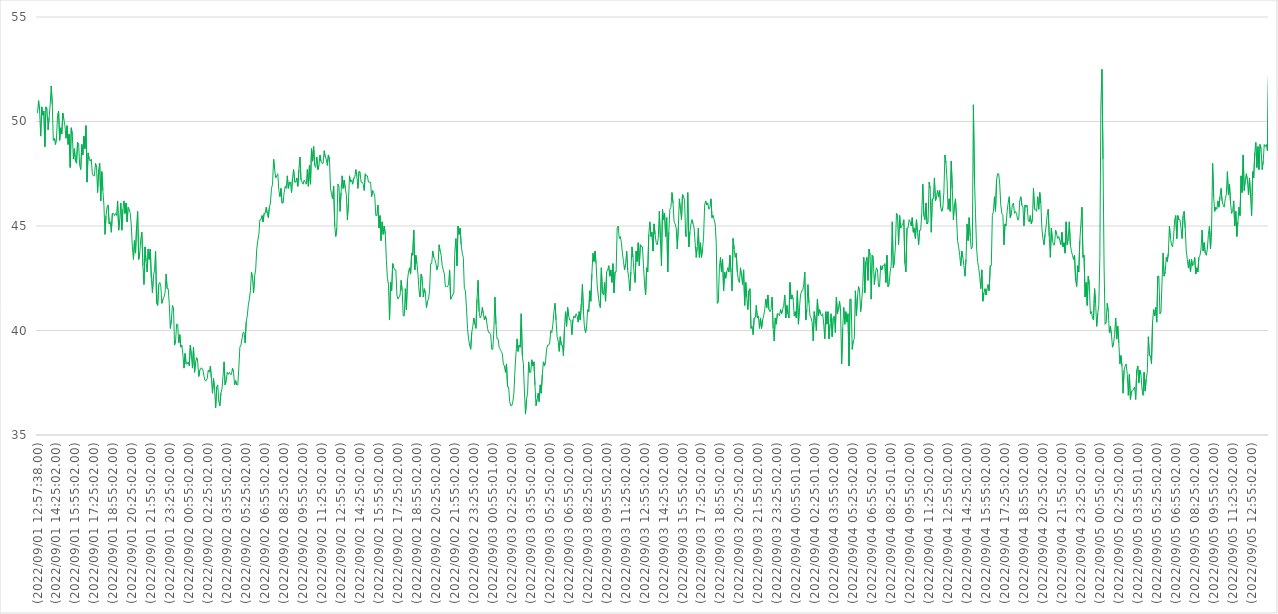
| Category | Series 0 |
|---|---|
| (2022/09/01 12:57:38.00) | 50.4 |
| (2022/09/01 13:00:01.00) | 51 |
| (2022/09/01 13:05:02.00) | 50.5 |
| (2022/09/01 13:10:01.00) | 49.3 |
| (2022/09/01 13:15:01.00) | 50.7 |
| (2022/09/01 13:20:01.00) | 50.3 |
| (2022/09/01 13:25:01.00) | 50.5 |
| (2022/09/01 13:30:01.00) | 48.8 |
| (2022/09/01 13:35:01.00) | 50.7 |
| (2022/09/01 13:40:01.00) | 50.6 |
| (2022/09/01 13:45:01.00) | 49.6 |
| (2022/09/01 13:50:02.00) | 50.2 |
| (2022/09/01 13:55:01.00) | 50.8 |
| (2022/09/01 14:00:02.00) | 51.7 |
| (2022/09/01 14:05:02.00) | 50.8 |
| (2022/09/01 14:10:01.00) | 49.1 |
| (2022/09/01 14:15:02.00) | 49.2 |
| (2022/09/01 14:20:01.00) | 48.9 |
| (2022/09/01 14:25:02.00) | 49.2 |
| (2022/09/01 14:30:01.00) | 50.3 |
| (2022/09/01 14:35:01.00) | 50.5 |
| (2022/09/01 14:40:02.00) | 49.1 |
| (2022/09/01 14:45:02.00) | 49.7 |
| (2022/09/01 14:50:02.00) | 49.4 |
| (2022/09/01 14:55:02.00) | 50.4 |
| (2022/09/01 15:00:02.00) | 50.1 |
| (2022/09/01 15:05:02.00) | 49.8 |
| (2022/09/01 15:10:02.00) | 49.2 |
| (2022/09/01 15:15:01.00) | 49.8 |
| (2022/09/01 15:20:02.00) | 48.9 |
| (2022/09/01 15:25:01.00) | 49.4 |
| (2022/09/01 15:30:02.00) | 47.8 |
| (2022/09/01 15:35:02.00) | 49.7 |
| (2022/09/01 15:40:01.00) | 49.4 |
| (2022/09/01 15:45:02.00) | 48.2 |
| (2022/09/01 15:50:01.00) | 48.7 |
| (2022/09/01 15:55:02.00) | 48.1 |
| (2022/09/01 16:00:02.00) | 48 |
| (2022/09/01 16:05:02.00) | 49 |
| (2022/09/01 16:10:02.00) | 48.9 |
| (2022/09/01 16:15:02.00) | 47.9 |
| (2022/09/01 16:20:02.00) | 47.7 |
| (2022/09/01 16:25:02.00) | 48.9 |
| (2022/09/01 16:30:02.00) | 48.4 |
| (2022/09/01 16:35:02.00) | 49.3 |
| (2022/09/01 16:40:02.00) | 48.7 |
| (2022/09/01 16:45:01.00) | 49.8 |
| (2022/09/01 16:50:02.00) | 47.1 |
| (2022/09/01 16:55:02.00) | 48.5 |
| (2022/09/01 17:00:02.00) | 48.2 |
| (2022/09/01 17:05:02.00) | 48.1 |
| (2022/09/01 17:10:01.00) | 48.2 |
| (2022/09/01 17:15:02.00) | 47.5 |
| (2022/09/01 17:20:02.00) | 47.4 |
| (2022/09/01 17:25:02.00) | 47.4 |
| (2022/09/01 17:30:02.00) | 48 |
| (2022/09/01 17:35:02.00) | 47.8 |
| (2022/09/01 17:40:02.00) | 46.6 |
| (2022/09/01 17:45:02.00) | 47.7 |
| (2022/09/01 17:50:02.00) | 48 |
| (2022/09/01 17:55:02.00) | 46.2 |
| (2022/09/01 18:00:02.00) | 47.6 |
| (2022/09/01 18:05:02.00) | 46.7 |
| (2022/09/01 18:10:02.00) | 46 |
| (2022/09/01 18:15:02.00) | 44.6 |
| (2022/09/01 18:20:02.00) | 45.5 |
| (2022/09/01 18:25:02.00) | 45.9 |
| (2022/09/01 18:30:02.00) | 46 |
| (2022/09/01 18:35:02.00) | 45.1 |
| (2022/09/01 18:40:02.00) | 45.2 |
| (2022/09/01 18:45:02.00) | 44.7 |
| (2022/09/01 18:50:02.00) | 45.6 |
| (2022/09/01 18:55:02.00) | 45.6 |
| (2022/09/01 19:00:02.00) | 45.5 |
| (2022/09/01 19:05:02.00) | 45.6 |
| (2022/09/01 19:10:02.00) | 45.5 |
| (2022/09/01 19:15:02.00) | 46.2 |
| (2022/09/01 19:20:02.00) | 44.8 |
| (2022/09/01 19:25:02.00) | 45.3 |
| (2022/09/01 19:30:02.00) | 46.1 |
| (2022/09/01 19:35:02.00) | 44.8 |
| (2022/09/01 19:40:02.00) | 45.8 |
| (2022/09/01 19:45:02.00) | 46.2 |
| (2022/09/01 19:50:02.00) | 45.6 |
| (2022/09/01 19:55:02.00) | 46.1 |
| (2022/09/01 20:00:02.00) | 45.2 |
| (2022/09/01 20:05:02.00) | 45.9 |
| (2022/09/01 20:10:02.00) | 45.8 |
| (2022/09/01 20:15:02.00) | 45.6 |
| (2022/09/01 20:20:02.00) | 45 |
| (2022/09/01 20:25:02.00) | 44 |
| (2022/09/01 20:30:02.00) | 43.4 |
| (2022/09/01 20:35:02.00) | 44.3 |
| (2022/09/01 20:40:02.00) | 43.7 |
| (2022/09/01 20:45:02.00) | 45 |
| (2022/09/01 20:50:02.00) | 45.7 |
| (2022/09/01 20:55:02.00) | 43.4 |
| (2022/09/01 21:00:02.00) | 43.7 |
| (2022/09/01 21:05:02.00) | 44.4 |
| (2022/09/01 21:10:02.00) | 44.7 |
| (2022/09/01 21:15:02.00) | 43.1 |
| (2022/09/01 21:20:02.00) | 42.2 |
| (2022/09/01 21:25:01.00) | 44 |
| (2022/09/01 21:30:02.00) | 43.3 |
| (2022/09/01 21:35:01.00) | 42.8 |
| (2022/09/01 21:40:02.00) | 43.9 |
| (2022/09/01 21:45:02.00) | 43.4 |
| (2022/09/01 21:50:02.00) | 43.9 |
| (2022/09/01 21:55:02.00) | 42.5 |
| (2022/09/01 22:00:02.00) | 41.8 |
| (2022/09/01 22:05:02.00) | 42.6 |
| (2022/09/01 22:10:02.00) | 42.9 |
| (2022/09/01 22:15:01.00) | 43.8 |
| (2022/09/01 22:20:02.00) | 41.3 |
| (2022/09/01 22:25:02.00) | 41.2 |
| (2022/09/01 22:30:02.00) | 42.2 |
| (2022/09/01 22:35:02.00) | 42.3 |
| (2022/09/01 22:40:02.00) | 42.1 |
| (2022/09/01 22:45:02.00) | 41.3 |
| (2022/09/01 22:50:01.00) | 41.5 |
| (2022/09/01 22:55:02.00) | 41.6 |
| (2022/09/01 23:00:02.00) | 41.8 |
| (2022/09/01 23:05:01.00) | 42.7 |
| (2022/09/01 23:10:02.00) | 42 |
| (2022/09/01 23:15:02.00) | 42 |
| (2022/09/01 23:20:01.00) | 41.3 |
| (2022/09/01 23:25:02.00) | 40.1 |
| (2022/09/01 23:30:02.00) | 40.5 |
| (2022/09/01 23:35:02.00) | 41.2 |
| (2022/09/01 23:40:02.00) | 41.1 |
| (2022/09/01 23:45:01.00) | 39.3 |
| (2022/09/01 23:50:02.00) | 39.5 |
| (2022/09/01 23:55:02.00) | 40.3 |
| (2022/09/02 00:00:02.00) | 40.3 |
| (2022/09/02 00:05:01.00) | 39.4 |
| (2022/09/02 00:10:01.00) | 39.8 |
| (2022/09/02 00:15:01.00) | 39.2 |
| (2022/09/02 00:20:01.00) | 39.3 |
| (2022/09/02 00:25:01.00) | 38.8 |
| (2022/09/02 00:30:02.00) | 38.2 |
| (2022/09/02 00:35:01.00) | 38.9 |
| (2022/09/02 00:40:01.00) | 38.4 |
| (2022/09/02 00:45:01.00) | 38.4 |
| (2022/09/02 00:50:01.00) | 38.5 |
| (2022/09/02 00:55:02.00) | 38.3 |
| (2022/09/02 01:00:01.00) | 39.3 |
| (2022/09/02 01:05:02.00) | 38.8 |
| (2022/09/02 01:10:01.00) | 38.2 |
| (2022/09/02 01:15:01.00) | 39.2 |
| (2022/09/02 01:20:02.00) | 38 |
| (2022/09/02 01:25:01.00) | 38.5 |
| (2022/09/02 01:30:02.00) | 38.7 |
| (2022/09/02 01:35:01.00) | 38.5 |
| (2022/09/02 01:40:02.00) | 37.8 |
| (2022/09/02 01:45:02.00) | 38.1 |
| (2022/09/02 01:50:02.00) | 38.2 |
| (2022/09/02 01:55:02.00) | 38.2 |
| (2022/09/02 02:00:02.00) | 38.1 |
| (2022/09/02 02:05:02.00) | 37.8 |
| (2022/09/02 02:10:01.00) | 37.6 |
| (2022/09/02 02:15:02.00) | 37.6 |
| (2022/09/02 02:20:02.00) | 37.7 |
| (2022/09/02 02:25:02.00) | 38.1 |
| (2022/09/02 02:30:01.00) | 38 |
| (2022/09/02 02:35:02.00) | 38.3 |
| (2022/09/02 02:40:02.00) | 37.7 |
| (2022/09/02 02:45:02.00) | 37 |
| (2022/09/02 02:50:02.00) | 37.7 |
| (2022/09/02 02:55:01.00) | 37.2 |
| (2022/09/02 03:00:02.00) | 36.3 |
| (2022/09/02 03:05:02.00) | 37.3 |
| (2022/09/02 03:10:02.00) | 37.4 |
| (2022/09/02 03:15:02.00) | 36.6 |
| (2022/09/02 03:20:02.00) | 36.4 |
| (2022/09/02 03:25:02.00) | 37 |
| (2022/09/02 03:30:02.00) | 37.2 |
| (2022/09/02 03:35:02.00) | 37.8 |
| (2022/09/02 03:40:02.00) | 38.5 |
| (2022/09/02 03:45:02.00) | 37.4 |
| (2022/09/02 03:50:01.00) | 37.6 |
| (2022/09/02 03:55:02.00) | 38 |
| (2022/09/02 04:00:02.00) | 37.9 |
| (2022/09/02 04:05:01.00) | 38 |
| (2022/09/02 04:10:02.00) | 37.9 |
| (2022/09/02 04:15:02.00) | 37.9 |
| (2022/09/02 04:20:01.00) | 38.2 |
| (2022/09/02 04:25:02.00) | 38 |
| (2022/09/02 04:30:02.00) | 37.4 |
| (2022/09/02 04:35:02.00) | 37.6 |
| (2022/09/02 04:40:02.00) | 37.4 |
| (2022/09/02 04:45:02.00) | 37.4 |
| (2022/09/02 04:50:02.00) | 38.2 |
| (2022/09/02 04:55:02.00) | 39.2 |
| (2022/09/02 05:00:02.00) | 39.3 |
| (2022/09/02 05:05:02.00) | 39.6 |
| (2022/09/02 05:10:01.00) | 39.9 |
| (2022/09/02 05:15:02.00) | 39.9 |
| (2022/09/02 05:20:02.00) | 39.4 |
| (2022/09/02 05:25:02.00) | 40.4 |
| (2022/09/02 05:30:02.00) | 40.7 |
| (2022/09/02 05:35:02.00) | 41.2 |
| (2022/09/02 05:40:02.00) | 41.5 |
| (2022/09/02 05:45:02.00) | 41.9 |
| (2022/09/02 05:50:02.00) | 42.8 |
| (2022/09/02 05:55:01.00) | 42.5 |
| (2022/09/02 06:00:02.00) | 41.8 |
| (2022/09/02 06:05:02.00) | 42.6 |
| (2022/09/02 06:10:02.00) | 42.9 |
| (2022/09/02 06:15:02.00) | 43.9 |
| (2022/09/02 06:20:02.00) | 44.3 |
| (2022/09/02 06:25:02.00) | 44.6 |
| (2022/09/02 06:30:02.00) | 45.3 |
| (2022/09/02 06:35:02.00) | 45.3 |
| (2022/09/02 06:40:02.00) | 45.5 |
| (2022/09/02 06:45:02.00) | 45.2 |
| (2022/09/02 06:50:02.00) | 45.6 |
| (2022/09/02 06:55:02.00) | 45.6 |
| (2022/09/02 07:00:02.00) | 45.9 |
| (2022/09/02 07:05:02.00) | 45.6 |
| (2022/09/02 07:10:02.00) | 45.4 |
| (2022/09/02 07:15:02.00) | 45.9 |
| (2022/09/02 07:20:02.00) | 46.1 |
| (2022/09/02 07:25:02.00) | 46.8 |
| (2022/09/02 07:30:02.00) | 47 |
| (2022/09/02 07:35:02.00) | 48.2 |
| (2022/09/02 07:40:02.00) | 47.7 |
| (2022/09/02 07:45:02.00) | 47.3 |
| (2022/09/02 07:50:02.00) | 47.4 |
| (2022/09/02 07:55:02.00) | 47.5 |
| (2022/09/02 08:00:02.00) | 46.7 |
| (2022/09/02 08:05:02.00) | 46.4 |
| (2022/09/02 08:10:02.00) | 46.8 |
| (2022/09/02 08:15:02.00) | 46.1 |
| (2022/09/02 08:20:01.00) | 46.1 |
| (2022/09/02 08:25:02.00) | 46.6 |
| (2022/09/02 08:30:02.00) | 46.9 |
| (2022/09/02 08:35:02.00) | 46.8 |
| (2022/09/02 08:40:02.00) | 47.4 |
| (2022/09/02 08:45:02.00) | 46.8 |
| (2022/09/02 08:50:02.00) | 47.1 |
| (2022/09/02 08:55:02.00) | 47.1 |
| (2022/09/02 09:00:01.00) | 46.6 |
| (2022/09/02 09:05:02.00) | 47.3 |
| (2022/09/02 09:10:02.00) | 47.7 |
| (2022/09/02 09:15:02.00) | 47.1 |
| (2022/09/02 09:20:02.00) | 47.1 |
| (2022/09/02 09:25:01.00) | 47.3 |
| (2022/09/02 09:30:02.00) | 46.9 |
| (2022/09/02 09:35:02.00) | 47.7 |
| (2022/09/02 09:40:02.00) | 48.3 |
| (2022/09/02 09:45:02.00) | 47.2 |
| (2022/09/02 09:50:01.00) | 47.1 |
| (2022/09/02 09:55:02.00) | 47 |
| (2022/09/02 10:00:02.00) | 47.2 |
| (2022/09/02 10:05:02.00) | 47.1 |
| (2022/09/02 10:10:02.00) | 47 |
| (2022/09/02 10:15:02.00) | 47.7 |
| (2022/09/02 10:20:02.00) | 46.9 |
| (2022/09/02 10:25:02.00) | 47.9 |
| (2022/09/02 10:30:02.00) | 47 |
| (2022/09/02 10:35:02.00) | 48.7 |
| (2022/09/02 10:40:02.00) | 48.1 |
| (2022/09/02 10:45:02.00) | 48.8 |
| (2022/09/02 10:50:02.00) | 47.9 |
| (2022/09/02 10:55:02.00) | 47.8 |
| (2022/09/02 11:00:02.00) | 48.3 |
| (2022/09/02 11:05:02.00) | 47.7 |
| (2022/09/02 11:10:02.00) | 47.9 |
| (2022/09/02 11:15:02.00) | 48.4 |
| (2022/09/02 11:20:02.00) | 48.1 |
| (2022/09/02 11:25:02.00) | 48 |
| (2022/09/02 11:30:02.00) | 48 |
| (2022/09/02 11:35:02.00) | 48.6 |
| (2022/09/02 11:40:02.00) | 48.3 |
| (2022/09/02 11:45:02.00) | 48.2 |
| (2022/09/02 11:50:02.00) | 47.9 |
| (2022/09/02 11:55:02.00) | 48.4 |
| (2022/09/02 12:00:02.00) | 48.2 |
| (2022/09/02 12:05:02.00) | 46.8 |
| (2022/09/02 12:10:02.00) | 46.5 |
| (2022/09/02 12:15:02.00) | 46.3 |
| (2022/09/02 12:20:02.00) | 46.9 |
| (2022/09/02 12:25:02.00) | 45 |
| (2022/09/02 12:30:02.00) | 44.5 |
| (2022/09/02 12:35:02.00) | 44.9 |
| (2022/09/02 12:40:02.00) | 47 |
| (2022/09/02 12:45:02.00) | 46.9 |
| (2022/09/02 12:50:02.00) | 45.7 |
| (2022/09/02 12:55:02.00) | 46.6 |
| (2022/09/02 13:00:02.00) | 47.4 |
| (2022/09/02 13:05:02.00) | 46.8 |
| (2022/09/02 13:10:02.00) | 47.2 |
| (2022/09/02 13:15:02.00) | 46.8 |
| (2022/09/02 13:20:02.00) | 46.5 |
| (2022/09/02 13:25:02.00) | 45.3 |
| (2022/09/02 13:30:02.00) | 46.1 |
| (2022/09/02 13:35:02.00) | 47.4 |
| (2022/09/02 13:40:02.00) | 47.1 |
| (2022/09/02 13:45:02.00) | 47.2 |
| (2022/09/02 13:50:02.00) | 47 |
| (2022/09/02 13:55:02.00) | 47.3 |
| (2022/09/02 14:00:02.00) | 47.3 |
| (2022/09/02 14:05:02.00) | 47.7 |
| (2022/09/02 14:10:02.00) | 47.4 |
| (2022/09/02 14:15:02.00) | 46.8 |
| (2022/09/02 14:20:01.00) | 47.6 |
| (2022/09/02 14:25:02.00) | 47.6 |
| (2022/09/02 14:30:02.00) | 47.1 |
| (2022/09/02 14:35:02.00) | 47.1 |
| (2022/09/02 14:40:02.00) | 47 |
| (2022/09/02 14:45:02.00) | 46.7 |
| (2022/09/02 14:50:02.00) | 47.5 |
| (2022/09/02 14:55:02.00) | 47.4 |
| (2022/09/02 15:00:02.00) | 47.4 |
| (2022/09/02 15:05:02.00) | 47.1 |
| (2022/09/02 15:10:02.00) | 47.1 |
| (2022/09/02 15:15:02.00) | 47.1 |
| (2022/09/02 15:20:02.00) | 46.4 |
| (2022/09/02 15:25:02.00) | 46.7 |
| (2022/09/02 15:30:02.00) | 46.6 |
| (2022/09/02 15:35:02.00) | 46.4 |
| (2022/09/02 15:40:02.00) | 45.5 |
| (2022/09/02 15:45:02.00) | 45.5 |
| (2022/09/02 15:50:02.00) | 46 |
| (2022/09/02 15:55:02.00) | 44.9 |
| (2022/09/02 16:00:02.00) | 45.5 |
| (2022/09/02 16:05:02.00) | 44.3 |
| (2022/09/02 16:10:02.00) | 45.2 |
| (2022/09/02 16:15:02.00) | 44.6 |
| (2022/09/02 16:20:02.00) | 45 |
| (2022/09/02 16:25:02.00) | 44.6 |
| (2022/09/02 16:30:02.00) | 43.4 |
| (2022/09/02 16:35:02.00) | 42.5 |
| (2022/09/02 16:40:02.00) | 42.2 |
| (2022/09/02 16:45:02.00) | 40.5 |
| (2022/09/02 16:50:02.00) | 42.3 |
| (2022/09/02 16:55:02.00) | 41.9 |
| (2022/09/02 17:00:02.00) | 43.2 |
| (2022/09/02 17:05:02.00) | 43 |
| (2022/09/02 17:10:02.00) | 42.9 |
| (2022/09/02 17:15:02.00) | 42.9 |
| (2022/09/02 17:20:02.00) | 41.7 |
| (2022/09/02 17:25:02.00) | 41.5 |
| (2022/09/02 17:30:02.00) | 41.6 |
| (2022/09/02 17:35:02.00) | 41.7 |
| (2022/09/02 17:40:02.00) | 42.4 |
| (2022/09/02 17:45:02.00) | 41.9 |
| (2022/09/02 17:50:02.00) | 40.7 |
| (2022/09/02 17:55:02.00) | 40.7 |
| (2022/09/02 18:00:01.00) | 42 |
| (2022/09/02 18:05:02.00) | 41 |
| (2022/09/02 18:10:02.00) | 42.4 |
| (2022/09/02 18:15:02.00) | 42.8 |
| (2022/09/02 18:20:02.00) | 43 |
| (2022/09/02 18:25:02.00) | 42.7 |
| (2022/09/02 18:30:02.00) | 43.7 |
| (2022/09/02 18:35:02.00) | 43.6 |
| (2022/09/02 18:40:02.00) | 44.8 |
| (2022/09/02 18:45:02.00) | 42.9 |
| (2022/09/02 18:50:02.00) | 43.6 |
| (2022/09/02 18:55:02.00) | 43.2 |
| (2022/09/02 19:00:02.00) | 42.7 |
| (2022/09/02 19:05:02.00) | 41.9 |
| (2022/09/02 19:10:02.00) | 41.6 |
| (2022/09/02 19:15:02.00) | 42.7 |
| (2022/09/02 19:20:02.00) | 42.5 |
| (2022/09/02 19:25:02.00) | 41.6 |
| (2022/09/02 19:30:02.00) | 42 |
| (2022/09/02 19:35:02.00) | 41.8 |
| (2022/09/02 19:40:02.00) | 41.1 |
| (2022/09/02 19:45:02.00) | 41.4 |
| (2022/09/02 19:50:02.00) | 41.5 |
| (2022/09/02 19:55:02.00) | 41.9 |
| (2022/09/02 20:00:02.00) | 43.2 |
| (2022/09/02 20:05:02.00) | 43.2 |
| (2022/09/02 20:10:02.00) | 43.8 |
| (2022/09/02 20:15:02.00) | 43.5 |
| (2022/09/02 20:20:02.00) | 43.4 |
| (2022/09/02 20:25:02.00) | 43.2 |
| (2022/09/02 20:30:02.00) | 42.9 |
| (2022/09/02 20:35:02.00) | 43.1 |
| (2022/09/02 20:40:02.00) | 44.1 |
| (2022/09/02 20:45:02.00) | 43.8 |
| (2022/09/02 20:50:02.00) | 43.6 |
| (2022/09/02 20:55:02.00) | 43.1 |
| (2022/09/02 21:00:02.00) | 42.9 |
| (2022/09/02 21:05:02.00) | 42.7 |
| (2022/09/02 21:10:02.00) | 42.1 |
| (2022/09/02 21:15:02.00) | 42.1 |
| (2022/09/02 21:20:02.00) | 42.1 |
| (2022/09/02 21:25:02.00) | 42.2 |
| (2022/09/02 21:30:02.00) | 42.9 |
| (2022/09/02 21:35:02.00) | 41.5 |
| (2022/09/02 21:40:02.00) | 41.6 |
| (2022/09/02 21:45:02.00) | 41.7 |
| (2022/09/02 21:50:02.00) | 41.8 |
| (2022/09/02 21:55:02.00) | 43.8 |
| (2022/09/02 22:00:02.00) | 44.4 |
| (2022/09/02 22:05:02.00) | 43.1 |
| (2022/09/02 22:10:02.00) | 45 |
| (2022/09/02 22:15:02.00) | 44.6 |
| (2022/09/02 22:20:02.00) | 44.9 |
| (2022/09/02 22:25:02.00) | 44.1 |
| (2022/09/02 22:30:02.00) | 43.7 |
| (2022/09/02 22:35:02.00) | 43.5 |
| (2022/09/02 22:40:02.00) | 42 |
| (2022/09/02 22:45:02.00) | 41.9 |
| (2022/09/02 22:50:02.00) | 41.1 |
| (2022/09/02 22:55:02.00) | 40.1 |
| (2022/09/02 23:00:02.00) | 39.6 |
| (2022/09/02 23:05:02.00) | 39.3 |
| (2022/09/02 23:10:02.00) | 39.1 |
| (2022/09/02 23:15:02.00) | 39.9 |
| (2022/09/02 23:20:02.00) | 40.2 |
| (2022/09/02 23:25:02.00) | 40.6 |
| (2022/09/02 23:30:02.00) | 40.3 |
| (2022/09/02 23:35:02.00) | 40.1 |
| (2022/09/02 23:40:02.00) | 41.5 |
| (2022/09/02 23:45:02.00) | 42.4 |
| (2022/09/02 23:50:02.00) | 40.9 |
| (2022/09/02 23:55:02.00) | 40.6 |
| (2022/09/03 00:00:02.00) | 40.7 |
| (2022/09/03 00:05:02.00) | 41.1 |
| (2022/09/03 00:10:01.00) | 40.8 |
| (2022/09/03 00:15:01.00) | 40.5 |
| (2022/09/03 00:20:02.00) | 40.7 |
| (2022/09/03 00:25:01.00) | 40.5 |
| (2022/09/03 00:30:02.00) | 40.1 |
| (2022/09/03 00:35:01.00) | 39.9 |
| (2022/09/03 00:40:02.00) | 39.9 |
| (2022/09/03 00:45:01.00) | 39.8 |
| (2022/09/03 00:50:01.00) | 39.1 |
| (2022/09/03 00:55:01.00) | 39.1 |
| (2022/09/03 01:00:01.00) | 40 |
| (2022/09/03 01:05:01.00) | 41.6 |
| (2022/09/03 01:10:01.00) | 40.3 |
| (2022/09/03 01:15:01.00) | 39.6 |
| (2022/09/03 01:20:02.00) | 39.6 |
| (2022/09/03 01:25:02.00) | 39.2 |
| (2022/09/03 01:30:01.00) | 39.1 |
| (2022/09/03 01:35:01.00) | 39 |
| (2022/09/03 01:40:02.00) | 38.9 |
| (2022/09/03 01:45:02.00) | 38.4 |
| (2022/09/03 01:50:02.00) | 38.3 |
| (2022/09/03 01:55:01.00) | 38 |
| (2022/09/03 02:00:02.00) | 38.4 |
| (2022/09/03 02:05:01.00) | 37.3 |
| (2022/09/03 02:10:02.00) | 37.3 |
| (2022/09/03 02:15:02.00) | 36.6 |
| (2022/09/03 02:20:02.00) | 36.4 |
| (2022/09/03 02:25:02.00) | 36.4 |
| (2022/09/03 02:30:01.00) | 36.6 |
| (2022/09/03 02:35:02.00) | 37 |
| (2022/09/03 02:40:02.00) | 38.1 |
| (2022/09/03 02:45:02.00) | 38.9 |
| (2022/09/03 02:50:01.00) | 39.6 |
| (2022/09/03 02:55:02.00) | 39 |
| (2022/09/03 03:00:02.00) | 39.3 |
| (2022/09/03 03:05:02.00) | 39.2 |
| (2022/09/03 03:10:02.00) | 40.8 |
| (2022/09/03 03:15:02.00) | 38.8 |
| (2022/09/03 03:20:02.00) | 38.4 |
| (2022/09/03 03:25:02.00) | 37.1 |
| (2022/09/03 03:30:01.00) | 36 |
| (2022/09/03 03:35:02.00) | 36.7 |
| (2022/09/03 03:40:01.00) | 37 |
| (2022/09/03 03:45:02.00) | 38.5 |
| (2022/09/03 03:50:01.00) | 38 |
| (2022/09/03 03:55:02.00) | 38 |
| (2022/09/03 04:00:02.00) | 38.6 |
| (2022/09/03 04:05:02.00) | 38.3 |
| (2022/09/03 04:10:01.00) | 38.5 |
| (2022/09/03 04:15:02.00) | 37.4 |
| (2022/09/03 04:20:02.00) | 36.4 |
| (2022/09/03 04:25:02.00) | 36.7 |
| (2022/09/03 04:30:02.00) | 37 |
| (2022/09/03 04:35:01.00) | 36.6 |
| (2022/09/03 04:40:02.00) | 37.4 |
| (2022/09/03 04:45:01.00) | 37 |
| (2022/09/03 04:50:02.00) | 37.9 |
| (2022/09/03 04:55:02.00) | 38.5 |
| (2022/09/03 05:00:02.00) | 38.3 |
| (2022/09/03 05:05:02.00) | 38.5 |
| (2022/09/03 05:10:02.00) | 39.1 |
| (2022/09/03 05:15:02.00) | 39.3 |
| (2022/09/03 05:20:02.00) | 39.3 |
| (2022/09/03 05:25:02.00) | 39.4 |
| (2022/09/03 05:30:02.00) | 40 |
| (2022/09/03 05:35:02.00) | 39.9 |
| (2022/09/03 05:40:02.00) | 40.3 |
| (2022/09/03 05:45:02.00) | 40.9 |
| (2022/09/03 05:50:02.00) | 41.3 |
| (2022/09/03 05:55:02.00) | 40.5 |
| (2022/09/03 06:00:02.00) | 39.7 |
| (2022/09/03 06:05:02.00) | 39.5 |
| (2022/09/03 06:10:02.00) | 39 |
| (2022/09/03 06:15:02.00) | 39.7 |
| (2022/09/03 06:20:02.00) | 39.3 |
| (2022/09/03 06:25:02.00) | 39.3 |
| (2022/09/03 06:30:02.00) | 38.8 |
| (2022/09/03 06:35:02.00) | 40.1 |
| (2022/09/03 06:40:02.00) | 40.9 |
| (2022/09/03 06:45:02.00) | 40.2 |
| (2022/09/03 06:50:02.00) | 41.1 |
| (2022/09/03 06:55:02.00) | 40.7 |
| (2022/09/03 07:00:02.00) | 40.5 |
| (2022/09/03 07:05:02.00) | 40.5 |
| (2022/09/03 07:10:02.00) | 39.8 |
| (2022/09/03 07:15:02.00) | 40.5 |
| (2022/09/03 07:20:02.00) | 40.7 |
| (2022/09/03 07:25:02.00) | 40.6 |
| (2022/09/03 07:30:02.00) | 40.8 |
| (2022/09/03 07:35:02.00) | 40.7 |
| (2022/09/03 07:40:02.00) | 40.4 |
| (2022/09/03 07:45:02.00) | 40.9 |
| (2022/09/03 07:50:02.00) | 40.5 |
| (2022/09/03 07:55:02.00) | 41.3 |
| (2022/09/03 08:00:02.00) | 42.2 |
| (2022/09/03 08:05:02.00) | 40.9 |
| (2022/09/03 08:10:02.00) | 40.1 |
| (2022/09/03 08:15:02.00) | 39.9 |
| (2022/09/03 08:20:02.00) | 40.2 |
| (2022/09/03 08:25:02.00) | 41 |
| (2022/09/03 08:30:02.00) | 40.9 |
| (2022/09/03 08:35:01.00) | 41.9 |
| (2022/09/03 08:40:02.00) | 41.4 |
| (2022/09/03 08:45:01.00) | 42.7 |
| (2022/09/03 08:50:02.00) | 43.7 |
| (2022/09/03 08:55:02.00) | 43.3 |
| (2022/09/03 09:00:01.00) | 43.8 |
| (2022/09/03 09:05:02.00) | 43.2 |
| (2022/09/03 09:10:02.00) | 42.2 |
| (2022/09/03 09:15:02.00) | 41.7 |
| (2022/09/03 09:20:02.00) | 41.3 |
| (2022/09/03 09:25:02.00) | 41.1 |
| (2022/09/03 09:30:02.00) | 43 |
| (2022/09/03 09:35:02.00) | 41.8 |
| (2022/09/03 09:40:02.00) | 41.7 |
| (2022/09/03 09:45:02.00) | 42.3 |
| (2022/09/03 09:50:02.00) | 41.4 |
| (2022/09/03 09:55:02.00) | 42.8 |
| (2022/09/03 10:00:02.00) | 42.9 |
| (2022/09/03 10:05:02.00) | 43.1 |
| (2022/09/03 10:10:02.00) | 42.6 |
| (2022/09/03 10:15:02.00) | 42.9 |
| (2022/09/03 10:20:02.00) | 42.3 |
| (2022/09/03 10:25:02.00) | 43.2 |
| (2022/09/03 10:30:02.00) | 41.8 |
| (2022/09/03 10:35:02.00) | 42.8 |
| (2022/09/03 10:40:02.00) | 42.8 |
| (2022/09/03 10:45:02.00) | 44.9 |
| (2022/09/03 10:50:02.00) | 45 |
| (2022/09/03 10:55:02.00) | 44.4 |
| (2022/09/03 11:00:02.00) | 44.5 |
| (2022/09/03 11:05:02.00) | 44.2 |
| (2022/09/03 11:10:02.00) | 43.7 |
| (2022/09/03 11:15:02.00) | 43.3 |
| (2022/09/03 11:20:02.00) | 42.9 |
| (2022/09/03 11:25:02.00) | 43.2 |
| (2022/09/03 11:30:02.00) | 43.8 |
| (2022/09/03 11:35:02.00) | 42.9 |
| (2022/09/03 11:40:02.00) | 42.5 |
| (2022/09/03 11:45:02.00) | 41.9 |
| (2022/09/03 11:50:02.00) | 42.8 |
| (2022/09/03 11:55:02.00) | 44 |
| (2022/09/03 12:00:02.00) | 43.5 |
| (2022/09/03 12:05:02.00) | 42.8 |
| (2022/09/03 12:10:02.00) | 42.3 |
| (2022/09/03 12:15:02.00) | 43.8 |
| (2022/09/03 12:20:02.00) | 43.3 |
| (2022/09/03 12:25:02.00) | 44.2 |
| (2022/09/03 12:30:02.00) | 43.1 |
| (2022/09/03 12:35:02.00) | 44.1 |
| (2022/09/03 12:40:02.00) | 44 |
| (2022/09/03 12:45:02.00) | 44 |
| (2022/09/03 12:50:02.00) | 43.1 |
| (2022/09/03 12:55:02.00) | 42.2 |
| (2022/09/03 13:00:02.00) | 41.7 |
| (2022/09/03 13:05:02.00) | 43 |
| (2022/09/03 13:10:02.00) | 42.8 |
| (2022/09/03 13:15:02.00) | 44.6 |
| (2022/09/03 13:20:02.00) | 45.2 |
| (2022/09/03 13:25:02.00) | 44.5 |
| (2022/09/03 13:30:02.00) | 44.7 |
| (2022/09/03 13:35:02.00) | 43.8 |
| (2022/09/03 13:40:02.00) | 45.1 |
| (2022/09/03 13:45:02.00) | 44.6 |
| (2022/09/03 13:50:02.00) | 44.2 |
| (2022/09/03 13:55:02.00) | 44.1 |
| (2022/09/03 14:00:02.00) | 44.4 |
| (2022/09/03 14:05:02.00) | 45.7 |
| (2022/09/03 14:10:02.00) | 44.4 |
| (2022/09/03 14:15:02.00) | 43.1 |
| (2022/09/03 14:20:02.00) | 45.8 |
| (2022/09/03 14:25:02.00) | 45.3 |
| (2022/09/03 14:30:02.00) | 45.6 |
| (2022/09/03 14:35:02.00) | 44.5 |
| (2022/09/03 14:40:02.00) | 45.4 |
| (2022/09/03 14:45:02.00) | 42.8 |
| (2022/09/03 14:50:02.00) | 44.7 |
| (2022/09/03 14:55:02.00) | 45.8 |
| (2022/09/03 15:00:02.00) | 45.9 |
| (2022/09/03 15:05:02.00) | 46.6 |
| (2022/09/03 15:10:02.00) | 46.1 |
| (2022/09/03 15:15:02.00) | 45.2 |
| (2022/09/03 15:20:02.00) | 45.1 |
| (2022/09/03 15:25:02.00) | 44.9 |
| (2022/09/03 15:30:02.00) | 43.9 |
| (2022/09/03 15:35:02.00) | 44.9 |
| (2022/09/03 15:40:02.00) | 46.3 |
| (2022/09/03 15:45:02.00) | 45.8 |
| (2022/09/03 15:50:02.00) | 45.3 |
| (2022/09/03 15:55:02.00) | 46.5 |
| (2022/09/03 16:00:02.00) | 46.4 |
| (2022/09/03 16:05:02.00) | 46.2 |
| (2022/09/03 16:10:02.00) | 44.5 |
| (2022/09/03 16:15:02.00) | 44.5 |
| (2022/09/03 16:20:02.00) | 46.6 |
| (2022/09/03 16:25:02.00) | 44 |
| (2022/09/03 16:30:02.00) | 44.7 |
| (2022/09/03 16:35:02.00) | 45.1 |
| (2022/09/03 16:40:02.00) | 45.3 |
| (2022/09/03 16:45:02.00) | 45.1 |
| (2022/09/03 16:50:02.00) | 44.9 |
| (2022/09/03 16:55:01.00) | 44.2 |
| (2022/09/03 17:00:02.00) | 43.5 |
| (2022/09/03 17:05:02.00) | 44 |
| (2022/09/03 17:10:02.00) | 44.9 |
| (2022/09/03 17:15:02.00) | 43.5 |
| (2022/09/03 17:20:02.00) | 44.2 |
| (2022/09/03 17:25:02.00) | 43.5 |
| (2022/09/03 17:30:01.00) | 43.9 |
| (2022/09/03 17:35:02.00) | 44.5 |
| (2022/09/03 17:40:02.00) | 46 |
| (2022/09/03 17:45:02.00) | 46.2 |
| (2022/09/03 17:50:02.00) | 46 |
| (2022/09/03 17:55:02.00) | 46.1 |
| (2022/09/03 18:00:02.00) | 45.8 |
| (2022/09/03 18:05:02.00) | 45.9 |
| (2022/09/03 18:10:02.00) | 46.3 |
| (2022/09/03 18:15:01.00) | 45.4 |
| (2022/09/03 18:20:02.00) | 45.5 |
| (2022/09/03 18:25:02.00) | 45.3 |
| (2022/09/03 18:30:02.00) | 45.1 |
| (2022/09/03 18:35:02.00) | 44.2 |
| (2022/09/03 18:40:02.00) | 41.3 |
| (2022/09/03 18:45:02.00) | 41.4 |
| (2022/09/03 18:50:02.00) | 43 |
| (2022/09/03 18:55:02.00) | 43.5 |
| (2022/09/03 19:00:02.00) | 42.8 |
| (2022/09/03 19:05:02.00) | 43.4 |
| (2022/09/03 19:10:02.00) | 41.9 |
| (2022/09/03 19:15:02.00) | 42.8 |
| (2022/09/03 19:20:02.00) | 42.5 |
| (2022/09/03 19:25:02.00) | 42.8 |
| (2022/09/03 19:30:02.00) | 43 |
| (2022/09/03 19:35:02.00) | 42.8 |
| (2022/09/03 19:40:02.00) | 43.6 |
| (2022/09/03 19:45:02.00) | 42.8 |
| (2022/09/03 19:50:02.00) | 41.9 |
| (2022/09/03 19:55:02.00) | 44.4 |
| (2022/09/03 20:00:02.00) | 43.9 |
| (2022/09/03 20:05:02.00) | 43.5 |
| (2022/09/03 20:10:02.00) | 43.7 |
| (2022/09/03 20:15:02.00) | 42.8 |
| (2022/09/03 20:20:02.00) | 42.4 |
| (2022/09/03 20:25:02.00) | 42.3 |
| (2022/09/03 20:30:02.00) | 43 |
| (2022/09/03 20:35:02.00) | 42.6 |
| (2022/09/03 20:40:02.00) | 42.2 |
| (2022/09/03 20:45:02.00) | 42.9 |
| (2022/09/03 20:50:02.00) | 41.2 |
| (2022/09/03 20:55:02.00) | 42.3 |
| (2022/09/03 21:00:02.00) | 41.6 |
| (2022/09/03 21:05:02.00) | 41 |
| (2022/09/03 21:10:02.00) | 41.9 |
| (2022/09/03 21:15:02.00) | 42 |
| (2022/09/03 21:20:02.00) | 40.1 |
| (2022/09/03 21:25:02.00) | 40.2 |
| (2022/09/03 21:30:01.00) | 39.8 |
| (2022/09/03 21:35:02.00) | 40.6 |
| (2022/09/03 21:40:02.00) | 40.6 |
| (2022/09/03 21:45:02.00) | 41.2 |
| (2022/09/03 21:50:02.00) | 40.6 |
| (2022/09/03 21:55:02.00) | 40.7 |
| (2022/09/03 22:00:02.00) | 40.1 |
| (2022/09/03 22:05:02.00) | 40.6 |
| (2022/09/03 22:10:02.00) | 40.1 |
| (2022/09/03 22:15:02.00) | 40.5 |
| (2022/09/03 22:20:02.00) | 40.7 |
| (2022/09/03 22:25:02.00) | 41 |
| (2022/09/03 22:30:02.00) | 41.5 |
| (2022/09/03 22:35:02.00) | 41.1 |
| (2022/09/03 22:40:02.00) | 41.7 |
| (2022/09/03 22:45:02.00) | 41 |
| (2022/09/03 22:50:02.00) | 40.9 |
| (2022/09/03 22:55:02.00) | 41 |
| (2022/09/03 23:00:02.00) | 41.6 |
| (2022/09/03 23:05:02.00) | 40.1 |
| (2022/09/03 23:10:02.00) | 39.5 |
| (2022/09/03 23:15:02.00) | 40.6 |
| (2022/09/03 23:20:02.00) | 40.3 |
| (2022/09/03 23:25:02.00) | 40.8 |
| (2022/09/03 23:30:02.00) | 40.8 |
| (2022/09/03 23:35:02.00) | 40.7 |
| (2022/09/03 23:40:02.00) | 41 |
| (2022/09/03 23:45:02.00) | 40.8 |
| (2022/09/03 23:50:02.00) | 41 |
| (2022/09/03 23:55:02.00) | 41.2 |
| (2022/09/04 00:00:02.00) | 41.7 |
| (2022/09/04 00:05:01.00) | 40.6 |
| (2022/09/04 00:10:01.00) | 41.2 |
| (2022/09/04 00:15:01.00) | 40.8 |
| (2022/09/04 00:20:01.00) | 40.6 |
| (2022/09/04 00:25:01.00) | 42.3 |
| (2022/09/04 00:30:01.00) | 41.5 |
| (2022/09/04 00:35:02.00) | 41.7 |
| (2022/09/04 00:40:02.00) | 41.5 |
| (2022/09/04 00:45:02.00) | 40.7 |
| (2022/09/04 00:50:01.00) | 40.9 |
| (2022/09/04 00:55:01.00) | 40.6 |
| (2022/09/04 01:00:02.00) | 41.9 |
| (2022/09/04 01:05:01.00) | 40.3 |
| (2022/09/04 01:10:02.00) | 41.1 |
| (2022/09/04 01:15:01.00) | 41.7 |
| (2022/09/04 01:20:01.00) | 41.9 |
| (2022/09/04 01:25:01.00) | 41.9 |
| (2022/09/04 01:30:02.00) | 42.2 |
| (2022/09/04 01:35:01.00) | 42.8 |
| (2022/09/04 01:40:02.00) | 40.5 |
| (2022/09/04 01:45:01.00) | 41 |
| (2022/09/04 01:50:01.00) | 42.2 |
| (2022/09/04 01:55:02.00) | 41.3 |
| (2022/09/04 02:00:02.00) | 40.7 |
| (2022/09/04 02:05:02.00) | 40.6 |
| (2022/09/04 02:10:01.00) | 40.4 |
| (2022/09/04 02:15:01.00) | 39.5 |
| (2022/09/04 02:20:02.00) | 40.9 |
| (2022/09/04 02:25:01.00) | 40.5 |
| (2022/09/04 02:30:02.00) | 40 |
| (2022/09/04 02:35:02.00) | 41.5 |
| (2022/09/04 02:40:02.00) | 40.7 |
| (2022/09/04 02:45:02.00) | 41 |
| (2022/09/04 02:50:02.00) | 40.8 |
| (2022/09/04 02:55:02.00) | 40.7 |
| (2022/09/04 03:00:02.00) | 40.8 |
| (2022/09/04 03:05:02.00) | 40.3 |
| (2022/09/04 03:10:02.00) | 39.6 |
| (2022/09/04 03:15:02.00) | 40.9 |
| (2022/09/04 03:20:01.00) | 40.3 |
| (2022/09/04 03:25:02.00) | 40.9 |
| (2022/09/04 03:30:01.00) | 39.6 |
| (2022/09/04 03:35:02.00) | 40.3 |
| (2022/09/04 03:40:02.00) | 40.8 |
| (2022/09/04 03:45:02.00) | 39.7 |
| (2022/09/04 03:50:02.00) | 40.6 |
| (2022/09/04 03:55:02.00) | 40.7 |
| (2022/09/04 04:00:02.00) | 39.9 |
| (2022/09/04 04:05:02.00) | 41.6 |
| (2022/09/04 04:10:02.00) | 40.8 |
| (2022/09/04 04:15:01.00) | 41.1 |
| (2022/09/04 04:20:02.00) | 41.4 |
| (2022/09/04 04:25:02.00) | 40.9 |
| (2022/09/04 04:30:02.00) | 38.4 |
| (2022/09/04 04:35:02.00) | 40.1 |
| (2022/09/04 04:40:02.00) | 41.1 |
| (2022/09/04 04:45:02.00) | 40.3 |
| (2022/09/04 04:50:02.00) | 40.9 |
| (2022/09/04 04:55:01.00) | 40.4 |
| (2022/09/04 05:00:02.00) | 40.8 |
| (2022/09/04 05:05:02.00) | 38.3 |
| (2022/09/04 05:10:02.00) | 41.5 |
| (2022/09/04 05:15:01.00) | 41.5 |
| (2022/09/04 05:20:02.00) | 39.1 |
| (2022/09/04 05:25:02.00) | 39.5 |
| (2022/09/04 05:30:02.00) | 39.6 |
| (2022/09/04 05:35:02.00) | 41.9 |
| (2022/09/04 05:40:02.00) | 40.7 |
| (2022/09/04 05:45:02.00) | 41.6 |
| (2022/09/04 05:50:02.00) | 42.1 |
| (2022/09/04 05:55:02.00) | 41.9 |
| (2022/09/04 06:00:02.00) | 40.9 |
| (2022/09/04 06:05:02.00) | 41.4 |
| (2022/09/04 06:10:02.00) | 42.1 |
| (2022/09/04 06:15:02.00) | 43.5 |
| (2022/09/04 06:20:02.00) | 41.8 |
| (2022/09/04 06:25:02.00) | 43.3 |
| (2022/09/04 06:30:02.00) | 43.5 |
| (2022/09/04 06:35:02.00) | 42.4 |
| (2022/09/04 06:40:01.00) | 43.9 |
| (2022/09/04 06:45:02.00) | 43.6 |
| (2022/09/04 06:50:02.00) | 41.5 |
| (2022/09/04 06:55:02.00) | 43.6 |
| (2022/09/04 07:00:02.00) | 43.5 |
| (2022/09/04 07:05:02.00) | 42.2 |
| (2022/09/04 07:10:02.00) | 42.7 |
| (2022/09/04 07:15:02.00) | 43 |
| (2022/09/04 07:20:02.00) | 42.9 |
| (2022/09/04 07:25:02.00) | 42.1 |
| (2022/09/04 07:30:02.00) | 42.1 |
| (2022/09/04 07:35:02.00) | 43.1 |
| (2022/09/04 07:40:02.00) | 42.9 |
| (2022/09/04 07:45:02.00) | 43.1 |
| (2022/09/04 07:50:02.00) | 43.1 |
| (2022/09/04 07:55:02.00) | 43.2 |
| (2022/09/04 08:00:02.00) | 42.3 |
| (2022/09/04 08:05:02.00) | 43.6 |
| (2022/09/04 08:10:02.00) | 42.1 |
| (2022/09/04 08:15:02.00) | 42.2 |
| (2022/09/04 08:20:02.00) | 42.8 |
| (2022/09/04 08:25:01.00) | 43.1 |
| (2022/09/04 08:30:02.00) | 45.2 |
| (2022/09/04 08:35:02.00) | 43 |
| (2022/09/04 08:40:02.00) | 43.3 |
| (2022/09/04 08:45:02.00) | 44 |
| (2022/09/04 08:50:02.00) | 45.6 |
| (2022/09/04 08:55:02.00) | 45.5 |
| (2022/09/04 09:00:01.00) | 44.1 |
| (2022/09/04 09:05:02.00) | 45.5 |
| (2022/09/04 09:10:01.00) | 44.9 |
| (2022/09/04 09:15:02.00) | 45 |
| (2022/09/04 09:20:02.00) | 45.1 |
| (2022/09/04 09:25:01.00) | 45.3 |
| (2022/09/04 09:30:02.00) | 43.2 |
| (2022/09/04 09:35:02.00) | 42.8 |
| (2022/09/04 09:40:02.00) | 44.9 |
| (2022/09/04 09:45:02.00) | 44.9 |
| (2022/09/04 09:50:02.00) | 45.3 |
| (2022/09/04 09:55:02.00) | 45.2 |
| (2022/09/04 10:00:02.00) | 45 |
| (2022/09/04 10:05:01.00) | 45.4 |
| (2022/09/04 10:10:02.00) | 44.7 |
| (2022/09/04 10:15:02.00) | 44.9 |
| (2022/09/04 10:20:02.00) | 44.4 |
| (2022/09/04 10:25:02.00) | 45.3 |
| (2022/09/04 10:30:02.00) | 44.7 |
| (2022/09/04 10:35:02.00) | 44.1 |
| (2022/09/04 10:40:02.00) | 44.8 |
| (2022/09/04 10:45:02.00) | 44.8 |
| (2022/09/04 10:50:02.00) | 45.6 |
| (2022/09/04 10:55:02.00) | 47 |
| (2022/09/04 11:00:02.00) | 45.5 |
| (2022/09/04 11:05:02.00) | 45.3 |
| (2022/09/04 11:10:02.00) | 46.1 |
| (2022/09/04 11:15:02.00) | 45.1 |
| (2022/09/04 11:20:02.00) | 45.2 |
| (2022/09/04 11:25:02.00) | 47.1 |
| (2022/09/04 11:30:02.00) | 46.8 |
| (2022/09/04 11:35:02.00) | 44.7 |
| (2022/09/04 11:40:02.00) | 46.3 |
| (2022/09/04 11:45:02.00) | 46.3 |
| (2022/09/04 11:50:02.00) | 47.3 |
| (2022/09/04 11:55:02.00) | 46.2 |
| (2022/09/04 12:00:02.00) | 46.4 |
| (2022/09/04 12:05:02.00) | 46.7 |
| (2022/09/04 12:10:02.00) | 46.4 |
| (2022/09/04 12:15:02.00) | 46.7 |
| (2022/09/04 12:20:02.00) | 45.9 |
| (2022/09/04 12:25:02.00) | 45.7 |
| (2022/09/04 12:30:02.00) | 45.9 |
| (2022/09/04 12:35:02.00) | 46.6 |
| (2022/09/04 12:40:02.00) | 48.4 |
| (2022/09/04 12:45:02.00) | 48 |
| (2022/09/04 12:50:02.00) | 47.2 |
| (2022/09/04 12:55:02.00) | 45.8 |
| (2022/09/04 13:00:02.00) | 46.3 |
| (2022/09/04 13:05:02.00) | 45.7 |
| (2022/09/04 13:10:02.00) | 48.1 |
| (2022/09/04 13:15:02.00) | 46.8 |
| (2022/09/04 13:20:02.00) | 45.3 |
| (2022/09/04 13:25:02.00) | 46 |
| (2022/09/04 13:30:02.00) | 46.3 |
| (2022/09/04 13:35:02.00) | 45.4 |
| (2022/09/04 13:40:02.00) | 44.3 |
| (2022/09/04 13:45:02.00) | 44 |
| (2022/09/04 13:50:02.00) | 43.6 |
| (2022/09/04 13:55:02.00) | 43.1 |
| (2022/09/04 14:00:02.00) | 43.8 |
| (2022/09/04 14:05:02.00) | 43.5 |
| (2022/09/04 14:10:02.00) | 43.1 |
| (2022/09/04 14:15:02.00) | 42.6 |
| (2022/09/04 14:20:02.00) | 43.4 |
| (2022/09/04 14:25:02.00) | 45.1 |
| (2022/09/04 14:30:02.00) | 44.3 |
| (2022/09/04 14:35:02.00) | 45.4 |
| (2022/09/04 14:40:02.00) | 44.5 |
| (2022/09/04 14:45:02.00) | 43.9 |
| (2022/09/04 14:50:02.00) | 44 |
| (2022/09/04 14:55:02.00) | 50.8 |
| (2022/09/04 15:00:02.00) | 47.3 |
| (2022/09/04 15:05:02.00) | 45.6 |
| (2022/09/04 15:10:02.00) | 44 |
| (2022/09/04 15:15:02.00) | 43.3 |
| (2022/09/04 15:20:02.00) | 43 |
| (2022/09/04 15:25:02.00) | 42.6 |
| (2022/09/04 15:30:02.00) | 42 |
| (2022/09/04 15:35:02.00) | 42.9 |
| (2022/09/04 15:40:02.00) | 41.4 |
| (2022/09/04 15:45:02.00) | 41.8 |
| (2022/09/04 15:50:02.00) | 42 |
| (2022/09/04 15:55:02.00) | 41.7 |
| (2022/09/04 16:00:02.00) | 42 |
| (2022/09/04 16:05:02.00) | 42.2 |
| (2022/09/04 16:10:02.00) | 41.9 |
| (2022/09/04 16:15:02.00) | 43.1 |
| (2022/09/04 16:20:02.00) | 43.1 |
| (2022/09/04 16:25:02.00) | 45.5 |
| (2022/09/04 16:30:02.00) | 45.7 |
| (2022/09/04 16:35:02.00) | 46.4 |
| (2022/09/04 16:40:02.00) | 45.7 |
| (2022/09/04 16:45:02.00) | 47.2 |
| (2022/09/04 16:50:01.00) | 47.5 |
| (2022/09/04 16:55:01.00) | 47.5 |
| (2022/09/04 17:00:02.00) | 47 |
| (2022/09/04 17:05:02.00) | 46 |
| (2022/09/04 17:10:02.00) | 45.6 |
| (2022/09/04 17:15:02.00) | 45.5 |
| (2022/09/04 17:20:02.00) | 44.1 |
| (2022/09/04 17:25:02.00) | 45.1 |
| (2022/09/04 17:30:02.00) | 45 |
| (2022/09/04 17:35:02.00) | 45.7 |
| (2022/09/04 17:40:02.00) | 46.1 |
| (2022/09/04 17:45:02.00) | 46.4 |
| (2022/09/04 17:50:02.00) | 45.4 |
| (2022/09/04 17:55:02.00) | 45.6 |
| (2022/09/04 18:00:01.00) | 46 |
| (2022/09/04 18:05:02.00) | 46.1 |
| (2022/09/04 18:10:02.00) | 45.6 |
| (2022/09/04 18:15:02.00) | 45.7 |
| (2022/09/04 18:20:02.00) | 45.6 |
| (2022/09/04 18:25:02.00) | 45.3 |
| (2022/09/04 18:30:02.00) | 45.3 |
| (2022/09/04 18:35:02.00) | 46.2 |
| (2022/09/04 18:40:02.00) | 46.4 |
| (2022/09/04 18:45:02.00) | 46 |
| (2022/09/04 18:50:02.00) | 45.9 |
| (2022/09/04 18:55:02.00) | 45 |
| (2022/09/04 19:00:02.00) | 46 |
| (2022/09/04 19:05:02.00) | 45.9 |
| (2022/09/04 19:10:02.00) | 46 |
| (2022/09/04 19:15:02.00) | 45.3 |
| (2022/09/04 19:20:02.00) | 45.2 |
| (2022/09/04 19:25:02.00) | 45.5 |
| (2022/09/04 19:30:01.00) | 45.1 |
| (2022/09/04 19:35:02.00) | 45.3 |
| (2022/09/04 19:40:02.00) | 46.8 |
| (2022/09/04 19:45:02.00) | 45.8 |
| (2022/09/04 19:50:02.00) | 45.8 |
| (2022/09/04 19:55:02.00) | 45.7 |
| (2022/09/04 20:00:02.00) | 46.4 |
| (2022/09/04 20:05:02.00) | 45.8 |
| (2022/09/04 20:10:02.00) | 46.6 |
| (2022/09/04 20:15:02.00) | 46.1 |
| (2022/09/04 20:20:02.00) | 44.9 |
| (2022/09/04 20:25:02.00) | 44.4 |
| (2022/09/04 20:30:02.00) | 44.1 |
| (2022/09/04 20:35:02.00) | 44.6 |
| (2022/09/04 20:40:02.00) | 45 |
| (2022/09/04 20:45:02.00) | 45.5 |
| (2022/09/04 20:50:02.00) | 45.8 |
| (2022/09/04 20:55:02.00) | 44.5 |
| (2022/09/04 21:00:02.00) | 43.5 |
| (2022/09/04 21:05:02.00) | 44.9 |
| (2022/09/04 21:10:02.00) | 44.3 |
| (2022/09/04 21:15:01.00) | 44.1 |
| (2022/09/04 21:20:02.00) | 44.1 |
| (2022/09/04 21:25:02.00) | 44.8 |
| (2022/09/04 21:30:02.00) | 44.6 |
| (2022/09/04 21:35:02.00) | 44.4 |
| (2022/09/04 21:40:02.00) | 44.5 |
| (2022/09/04 21:45:02.00) | 44.3 |
| (2022/09/04 21:50:02.00) | 44.1 |
| (2022/09/04 21:55:02.00) | 44.7 |
| (2022/09/04 22:00:02.00) | 44 |
| (2022/09/04 22:05:02.00) | 44.2 |
| (2022/09/04 22:10:02.00) | 43.7 |
| (2022/09/04 22:15:02.00) | 45.2 |
| (2022/09/04 22:20:02.00) | 44.1 |
| (2022/09/04 22:25:02.00) | 44.4 |
| (2022/09/04 22:30:02.00) | 45.2 |
| (2022/09/04 22:35:02.00) | 44.1 |
| (2022/09/04 22:40:02.00) | 43.8 |
| (2022/09/04 22:45:02.00) | 43.6 |
| (2022/09/04 22:50:02.00) | 43.4 |
| (2022/09/04 22:55:02.00) | 43.6 |
| (2022/09/04 23:00:02.00) | 42.4 |
| (2022/09/04 23:05:02.00) | 42.1 |
| (2022/09/04 23:10:02.00) | 43.1 |
| (2022/09/04 23:15:02.00) | 42.8 |
| (2022/09/04 23:20:02.00) | 44.3 |
| (2022/09/04 23:25:02.00) | 45.1 |
| (2022/09/04 23:30:02.00) | 45.9 |
| (2022/09/04 23:35:02.00) | 43.5 |
| (2022/09/04 23:40:02.00) | 43.6 |
| (2022/09/04 23:45:02.00) | 41.6 |
| (2022/09/04 23:50:02.00) | 42.3 |
| (2022/09/04 23:55:02.00) | 41.2 |
| (2022/09/05 00:00:02.00) | 42.6 |
| (2022/09/05 00:05:02.00) | 42.2 |
| (2022/09/05 00:10:01.00) | 40.8 |
| (2022/09/05 00:15:02.00) | 40.9 |
| (2022/09/05 00:20:01.00) | 40.6 |
| (2022/09/05 00:25:02.00) | 40.5 |
| (2022/09/05 00:30:01.00) | 42 |
| (2022/09/05 00:35:01.00) | 41.3 |
| (2022/09/05 00:40:01.00) | 40.2 |
| (2022/09/05 00:45:01.00) | 40.8 |
| (2022/09/05 00:50:01.00) | 41.2 |
| (2022/09/05 00:55:02.00) | 43.5 |
| (2022/09/05 01:00:02.00) | 50.8 |
| (2022/09/05 01:05:02.00) | 52.5 |
| (2022/09/05 01:10:02.00) | 48.2 |
| (2022/09/05 01:15:01.00) | 43.1 |
| (2022/09/05 01:20:02.00) | 40.3 |
| (2022/09/05 01:25:01.00) | 40.4 |
| (2022/09/05 01:30:01.00) | 41.3 |
| (2022/09/05 01:35:02.00) | 40.9 |
| (2022/09/05 01:40:02.00) | 39.9 |
| (2022/09/05 01:45:02.00) | 40.2 |
| (2022/09/05 01:50:02.00) | 39.8 |
| (2022/09/05 01:55:02.00) | 39.2 |
| (2022/09/05 02:00:02.00) | 39.4 |
| (2022/09/05 02:05:02.00) | 39.8 |
| (2022/09/05 02:10:02.00) | 40.6 |
| (2022/09/05 02:15:02.00) | 39.6 |
| (2022/09/05 02:20:02.00) | 40.2 |
| (2022/09/05 02:25:02.00) | 39.4 |
| (2022/09/05 02:30:02.00) | 38.4 |
| (2022/09/05 02:35:02.00) | 38.8 |
| (2022/09/05 02:40:02.00) | 38.3 |
| (2022/09/05 02:45:02.00) | 37 |
| (2022/09/05 02:50:01.00) | 38.1 |
| (2022/09/05 02:55:02.00) | 38.3 |
| (2022/09/05 03:00:02.00) | 38.4 |
| (2022/09/05 03:05:02.00) | 37.9 |
| (2022/09/05 03:10:02.00) | 36.9 |
| (2022/09/05 03:15:02.00) | 37.9 |
| (2022/09/05 03:20:02.00) | 36.7 |
| (2022/09/05 03:25:02.00) | 37.1 |
| (2022/09/05 03:30:02.00) | 37.1 |
| (2022/09/05 03:35:02.00) | 37.2 |
| (2022/09/05 03:40:02.00) | 37.3 |
| (2022/09/05 03:45:02.00) | 36.7 |
| (2022/09/05 03:50:02.00) | 38.1 |
| (2022/09/05 03:55:01.00) | 38.3 |
| (2022/09/05 04:00:02.00) | 37.5 |
| (2022/09/05 04:05:02.00) | 38.1 |
| (2022/09/05 04:10:02.00) | 37.9 |
| (2022/09/05 04:15:02.00) | 37.2 |
| (2022/09/05 04:20:01.00) | 36.9 |
| (2022/09/05 04:25:02.00) | 38 |
| (2022/09/05 04:30:02.00) | 37.1 |
| (2022/09/05 04:35:02.00) | 37.7 |
| (2022/09/05 04:40:02.00) | 38 |
| (2022/09/05 04:45:02.00) | 39.7 |
| (2022/09/05 04:50:01.00) | 38.8 |
| (2022/09/05 04:55:02.00) | 38.8 |
| (2022/09/05 05:00:02.00) | 38.4 |
| (2022/09/05 05:05:02.00) | 40.4 |
| (2022/09/05 05:10:02.00) | 41 |
| (2022/09/05 05:15:02.00) | 40.7 |
| (2022/09/05 05:20:02.00) | 41.1 |
| (2022/09/05 05:25:02.00) | 40.4 |
| (2022/09/05 05:30:01.00) | 42.6 |
| (2022/09/05 05:35:02.00) | 42.6 |
| (2022/09/05 05:40:02.00) | 40.8 |
| (2022/09/05 05:45:02.00) | 40.9 |
| (2022/09/05 05:50:02.00) | 42.3 |
| (2022/09/05 05:55:02.00) | 43.7 |
| (2022/09/05 06:00:02.00) | 42.6 |
| (2022/09/05 06:05:02.00) | 42.8 |
| (2022/09/05 06:10:02.00) | 43.5 |
| (2022/09/05 06:15:02.00) | 43.3 |
| (2022/09/05 06:20:02.00) | 43.7 |
| (2022/09/05 06:25:02.00) | 45 |
| (2022/09/05 06:30:02.00) | 44.4 |
| (2022/09/05 06:35:02.00) | 44.1 |
| (2022/09/05 06:40:02.00) | 44 |
| (2022/09/05 06:45:02.00) | 44.5 |
| (2022/09/05 06:50:02.00) | 45.3 |
| (2022/09/05 06:55:02.00) | 45.5 |
| (2022/09/05 07:00:02.00) | 44.4 |
| (2022/09/05 07:05:02.00) | 45.5 |
| (2022/09/05 07:10:02.00) | 45.3 |
| (2022/09/05 07:15:02.00) | 45.3 |
| (2022/09/05 07:20:02.00) | 44.9 |
| (2022/09/05 07:25:02.00) | 44.4 |
| (2022/09/05 07:30:02.00) | 45.5 |
| (2022/09/05 07:35:02.00) | 45.7 |
| (2022/09/05 07:40:02.00) | 44.9 |
| (2022/09/05 07:45:02.00) | 43.8 |
| (2022/09/05 07:50:02.00) | 43.4 |
| (2022/09/05 07:55:02.00) | 43 |
| (2022/09/05 08:00:02.00) | 43.4 |
| (2022/09/05 08:05:02.00) | 42.8 |
| (2022/09/05 08:10:02.00) | 43.4 |
| (2022/09/05 08:15:02.00) | 43.1 |
| (2022/09/05 08:20:02.00) | 43.2 |
| (2022/09/05 08:25:02.00) | 43.5 |
| (2022/09/05 08:30:01.00) | 42.7 |
| (2022/09/05 08:35:02.00) | 43 |
| (2022/09/05 08:40:02.00) | 42.8 |
| (2022/09/05 08:45:02.00) | 43.5 |
| (2022/09/05 08:50:02.00) | 43.6 |
| (2022/09/05 08:55:02.00) | 43.9 |
| (2022/09/05 09:00:02.00) | 44.8 |
| (2022/09/05 09:05:02.00) | 43.8 |
| (2022/09/05 09:10:02.00) | 44.2 |
| (2022/09/05 09:15:02.00) | 43.7 |
| (2022/09/05 09:20:02.00) | 43.6 |
| (2022/09/05 09:25:02.00) | 43.9 |
| (2022/09/05 09:30:02.00) | 44.6 |
| (2022/09/05 09:35:02.00) | 45 |
| (2022/09/05 09:40:02.00) | 43.9 |
| (2022/09/05 09:45:02.00) | 44.9 |
| (2022/09/05 09:50:02.00) | 48 |
| (2022/09/05 09:55:02.00) | 46.4 |
| (2022/09/05 10:00:02.00) | 45.7 |
| (2022/09/05 10:05:02.00) | 45.9 |
| (2022/09/05 10:10:02.00) | 45.8 |
| (2022/09/05 10:15:02.00) | 46.2 |
| (2022/09/05 10:20:02.00) | 45.9 |
| (2022/09/05 10:25:02.00) | 46.4 |
| (2022/09/05 10:30:02.00) | 46.8 |
| (2022/09/05 10:35:02.00) | 46.2 |
| (2022/09/05 10:40:02.00) | 46 |
| (2022/09/05 10:45:02.00) | 45.9 |
| (2022/09/05 10:50:02.00) | 46.3 |
| (2022/09/05 10:55:02.00) | 46.5 |
| (2022/09/05 11:00:02.00) | 47.6 |
| (2022/09/05 11:05:02.00) | 46.5 |
| (2022/09/05 11:10:02.00) | 47 |
| (2022/09/05 11:15:02.00) | 46.1 |
| (2022/09/05 11:20:02.00) | 45.6 |
| (2022/09/05 11:25:02.00) | 45.7 |
| (2022/09/05 11:30:02.00) | 46.2 |
| (2022/09/05 11:35:02.00) | 45 |
| (2022/09/05 11:40:02.00) | 45.7 |
| (2022/09/05 11:45:02.00) | 44.5 |
| (2022/09/05 11:50:02.00) | 45.2 |
| (2022/09/05 11:55:02.00) | 45.9 |
| (2022/09/05 12:00:02.00) | 45.5 |
| (2022/09/05 12:05:02.00) | 47.4 |
| (2022/09/05 12:10:02.00) | 46.6 |
| (2022/09/05 12:15:02.00) | 48.4 |
| (2022/09/05 12:20:02.00) | 46.7 |
| (2022/09/05 12:25:02.00) | 47.2 |
| (2022/09/05 12:30:02.00) | 47.5 |
| (2022/09/05 12:35:02.00) | 47.2 |
| (2022/09/05 12:40:02.00) | 46.5 |
| (2022/09/05 12:45:02.00) | 47.3 |
| (2022/09/05 12:50:02.00) | 46.4 |
| (2022/09/05 12:55:02.00) | 45.5 |
| (2022/09/05 13:00:02.00) | 47.6 |
| (2022/09/05 13:05:02.00) | 47.3 |
| (2022/09/05 13:10:02.00) | 48.5 |
| (2022/09/05 13:15:02.00) | 49 |
| (2022/09/05 13:20:02.00) | 47.8 |
| (2022/09/05 13:25:02.00) | 48.8 |
| (2022/09/05 13:30:02.00) | 47.7 |
| (2022/09/05 13:35:02.00) | 48.9 |
| (2022/09/05 13:40:02.00) | 48.7 |
| (2022/09/05 13:45:02.00) | 47.7 |
| (2022/09/05 13:50:02.00) | 48.1 |
| (2022/09/05 13:55:02.00) | 48.9 |
| (2022/09/05 14:00:02.00) | 48.8 |
| (2022/09/05 14:05:02.00) | 48.9 |
| (2022/09/05 14:10:02.00) | 48.6 |
| (2022/09/05 14:15:02.00) | 52.2 |